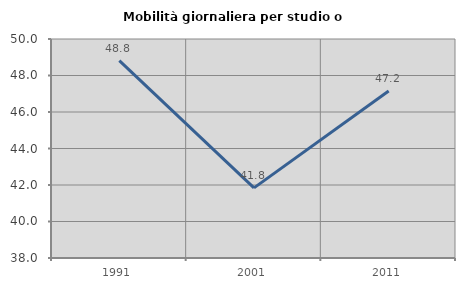
| Category | Mobilità giornaliera per studio o lavoro |
|---|---|
| 1991.0 | 48.82 |
| 2001.0 | 41.843 |
| 2011.0 | 47.15 |